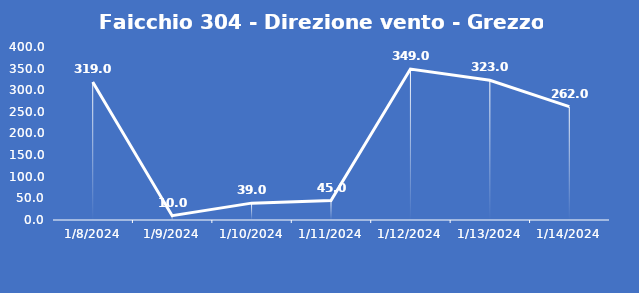
| Category | Faicchio 304 - Direzione vento - Grezzo (°N) |
|---|---|
| 1/8/24 | 319 |
| 1/9/24 | 10 |
| 1/10/24 | 39 |
| 1/11/24 | 45 |
| 1/12/24 | 349 |
| 1/13/24 | 323 |
| 1/14/24 | 262 |